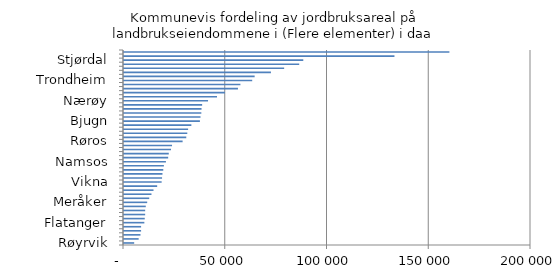
| Category | Totalt |
|---|---|
| Røyrvik | 5000 |
| Namsskogan | 7200 |
| Tydal | 8100 |
| Frøya | 8400 |
| Osen | 8400 |
| Flatanger | 10000 |
| Leka | 10200 |
| Roan | 10400 |
| Klæbu | 10400 |
| Fosnes | 10700 |
| Meråker | 11400 |
| Verran | 12400 |
| Snillfjord | 13500 |
| Malvik | 14500 |
| Lierne | 16300 |
| Vikna | 18500 |
| Agdenes | 18700 |
| Høylandet | 18900 |
| Hitra | 19300 |
| Holtålen | 19600 |
| Namsos | 20600 |
| Grong | 21700 |
| Hemne | 22000 |
| Frosta | 23100 |
| Leksvik | 23600 |
| Røros | 28800 |
| Åfjord | 30600 |
| Namdalseid | 31100 |
| Meldal | 31500 |
| Skaun | 33100 |
| Bjugn | 37300 |
| Selbu | 37600 |
| Rennebu | 38000 |
| Snåsa | 38100 |
| Ørland | 38400 |
| Nærøy | 41300 |
| Overhalla | 45700 |
| Orkdal | 49600 |
| Midtre Gauldal | 56000 |
| Rissa | 57200 |
| Trondheim | 63000 |
| Inderøy | 64200 |
| Melhus | 72200 |
| Oppdal | 78700 |
| Verdal | 86100 |
| Stjørdal | 88100 |
| Levanger | 132900 |
| Steinkjer | 159900 |